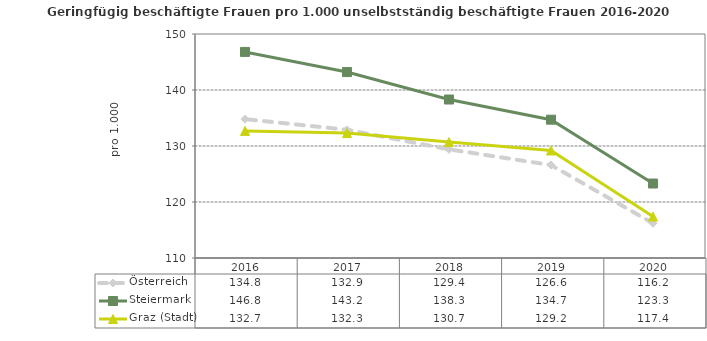
| Category | Österreich | Steiermark | Graz (Stadt) |
|---|---|---|---|
| 2020.0 | 116.2 | 123.3 | 117.4 |
| 2019.0 | 126.6 | 134.7 | 129.2 |
| 2018.0 | 129.4 | 138.3 | 130.7 |
| 2017.0 | 132.9 | 143.2 | 132.3 |
| 2016.0 | 134.8 | 146.8 | 132.7 |